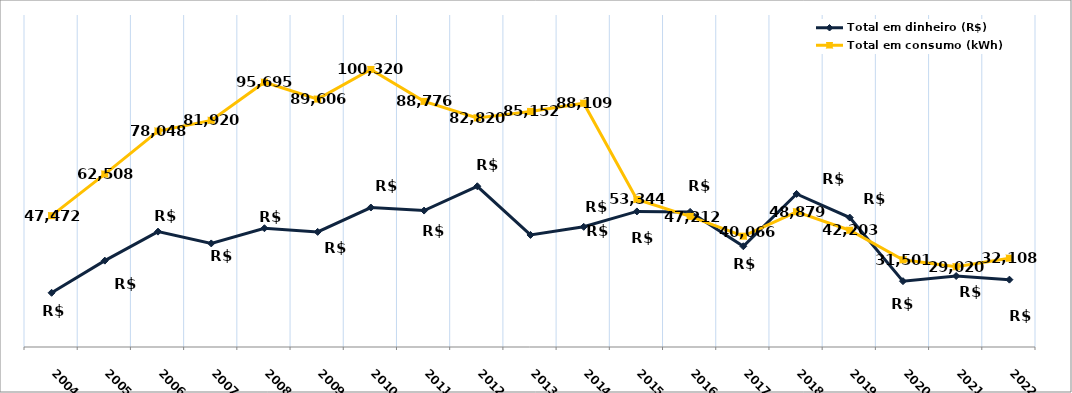
| Category | Total em dinheiro (R$) | Total em consumo (kWh) |
|---|---|---|
| 2004.0 | 19593.51 | 47472 |
| 2005.0 | 31216.71 | 62508 |
| 2006.0 | 41704.82 | 78048 |
| 2007.0 | 37434.66 | 81920 |
| 2008.0 | 42928.85 | 95695 |
| 2009.0 | 41603.96 | 89606 |
| 2010.0 | 50412.45 | 100320 |
| 2011.0 | 49310.52 | 88776 |
| 2012.0 | 58093.55 | 82820 |
| 2013.0 | 40496.51 | 85152 |
| 2014.0 | 43441.11 | 88109 |
| 2015.0 | 49003.02 | 53344 |
| 2016.0 | 48835.1 | 47212 |
| 2017.0 | 36407.12 | 40066 |
| 2018.0 | 55324.73 | 48879 |
| 2019.0 | 46788.46 | 42203 |
| 2020.0 | 23798.02 | 31501 |
| 2021.0 | 25666.47 | 29020 |
| 2022.0 | 24344.73 | 32108 |